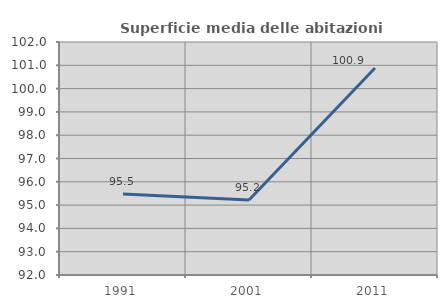
| Category | Superficie media delle abitazioni occupate |
|---|---|
| 1991.0 | 95.482 |
| 2001.0 | 95.22 |
| 2011.0 | 100.884 |